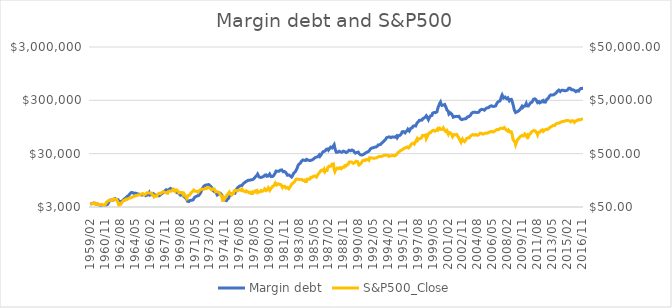
| Category | Margin debt |
|---|---|
| 1959/02 | 3452 |
| 1959/03 | 3410 |
| 1959/04 | 3458 |
| 1959/05 | 3567 |
| 1959/06 | 3549 |
| 1959/07 | 3546 |
| 1959/08 | 3528 |
| 1959/09 | 3424 |
| 1959/10 | 3406 |
| 1959/11 | 3378 |
| 1959/12 | 3438 |
| 1960/01 | 3430 |
| 1960/02 | 3333 |
| 1960/03 | 3267 |
| 1960/04 | 3145 |
| 1960/05 | 3150 |
| 1960/06 | 3151 |
| 1960/07 | 3188 |
| 1960/08 | 3113 |
| 1960/09 | 3220 |
| 1960/10 | 3259 |
| 1960/11 | 3243 |
| 1960/12 | 3240 |
| 1961/01 | 3317 |
| 1961/02 | 3330 |
| 1961/03 | 3426 |
| 1961/04 | 3656 |
| 1961/05 | 3986 |
| 1961/06 | 4100 |
| 1961/07 | 4076 |
| 1961/08 | 4041 |
| 1961/09 | 4021 |
| 1961/10 | 4037 |
| 1961/11 | 4072 |
| 1961/12 | 4180 |
| 1962/01 | 4294 |
| 1962/02 | 4145 |
| 1962/03 | 4100 |
| 1962/04 | 4117 |
| 1962/05 | 4115 |
| 1962/06 | 4034 |
| 1962/07 | 3637 |
| 1962/08 | 3592 |
| 1962/09 | 3796 |
| 1962/10 | 3914 |
| 1962/11 | 3889 |
| 1962/12 | 3975 |
| 1963/01 | 4149 |
| 1963/02 | 4236 |
| 1963/03 | 4355 |
| 1963/04 | 4358 |
| 1963/05 | 4551 |
| 1963/06 | 4760 |
| 1963/07 | 4930 |
| 1963/08 | 4920 |
| 1963/09 | 5057 |
| 1963/10 | 5356 |
| 1963/11 | 5524 |
| 1963/12 | 5621 |
| 1964/01 | 5541 |
| 1964/02 | 5546 |
| 1964/03 | 5405 |
| 1964/04 | 5387 |
| 1964/05 | 5531 |
| 1964/06 | 5458 |
| 1964/07 | 5388 |
| 1964/08 | 5314 |
| 1964/09 | 5207 |
| 1964/10 | 5241 |
| 1964/11 | 5205 |
| 1964/12 | 5181 |
| 1965/01 | 5101 |
| 1965/02 | 5019 |
| 1965/03 | 5038 |
| 1965/04 | 5085 |
| 1965/05 | 5096 |
| 1965/06 | 5154 |
| 1965/07 | 5139 |
| 1965/08 | 4887 |
| 1965/09 | 4908 |
| 1965/10 | 5016 |
| 1965/11 | 5096 |
| 1965/12 | 5232 |
| 1966/01 | 5543 |
| 1966/02 | 5020 |
| 1966/03 | 5110 |
| 1966/04 | 5120 |
| 1966/05 | 5270 |
| 1966/06 | 5070 |
| 1966/07 | 5310 |
| 1966/08 | 5180 |
| 1966/09 | 5060 |
| 1966/10 | 5020 |
| 1966/11 | 4950 |
| 1966/12 | 4950 |
| 1967/01 | 4910 |
| 1967/02 | 4810 |
| 1967/03 | 4870 |
| 1967/04 | 5010 |
| 1967/05 | 5090 |
| 1967/06 | 5160 |
| 1967/07 | 5360 |
| 1967/08 | 5490 |
| 1967/09 | 5620 |
| 1967/10 | 5810 |
| 1967/11 | 6020 |
| 1967/12 | 6090 |
| 1968/01 | 6310 |
| 1968/02 | 6150 |
| 1968/03 | 6150 |
| 1968/04 | 6190 |
| 1968/05 | 6430 |
| 1968/06 | 6640 |
| 1968/07 | 6690 |
| 1968/08 | 6510 |
| 1968/09 | 6430 |
| 1968/10 | 6380 |
| 1968/11 | 6240 |
| 1968/12 | 6200 |
| 1969/01 | 6220 |
| 1969/02 | 5930 |
| 1969/03 | 5750 |
| 1969/04 | 5600 |
| 1969/05 | 5570 |
| 1969/06 | 5670 |
| 1969/07 | 5340 |
| 1969/08 | 5170 |
| 1969/09 | 5000 |
| 1969/10 | 4940 |
| 1969/11 | 5040 |
| 1969/12 | 5070 |
| 1970/01 | 4970 |
| 1970/02 | 4680 |
| 1970/03 | 4570 |
| 1970/04 | 4520 |
| 1970/05 | 4360 |
| 1970/06 | 4160 |
| 1970/07 | 3850 |
| 1970/08 | 3780 |
| 1970/09 | 3800 |
| 1970/10 | 3910 |
| 1970/11 | 3990 |
| 1970/12 | 4000 |
| 1971/01 | 4010 |
| 1971/02 | 3990 |
| 1971/03 | 4090 |
| 1971/04 | 4300 |
| 1971/05 | 4530 |
| 1971/06 | 4620 |
| 1971/07 | 4720 |
| 1971/08 | 4790 |
| 1971/09 | 4850 |
| 1971/10 | 4930 |
| 1971/11 | 4950 |
| 1971/12 | 4910 |
| 1972/01 | 5400 |
| 1972/02 | 5700 |
| 1972/03 | 6180 |
| 1972/04 | 6620 |
| 1972/05 | 7010 |
| 1972/06 | 7200 |
| 1972/07 | 7510 |
| 1972/08 | 7660 |
| 1972/09 | 7780 |
| 1972/10 | 7800 |
| 1972/11 | 7800 |
| 1972/12 | 7890 |
| 1973/01 | 7900 |
| 1973/02 | 7700 |
| 1973/03 | 7500 |
| 1973/04 | 7200 |
| 1973/05 | 7040 |
| 1973/06 | 6540 |
| 1973/07 | 6180 |
| 1973/08 | 6010 |
| 1973/09 | 5830 |
| 1973/10 | 5730 |
| 1973/11 | 5690 |
| 1973/12 | 5460 |
| 1974/01 | 5050 |
| 1974/02 | 5210 |
| 1974/03 | 5310 |
| 1974/04 | 5420 |
| 1974/05 | 5450 |
| 1974/06 | 5260 |
| 1974/07 | 5160 |
| 1974/08 | 4840 |
| 1974/09 | 4590 |
| 1974/10 | 4090 |
| 1974/11 | 4000 |
| 1974/12 | 4040 |
| 1975/01 | 3910 |
| 1975/02 | 3950 |
| 1975/03 | 4130 |
| 1975/04 | 4180 |
| 1975/05 | 4360 |
| 1975/06 | 4700 |
| 1975/07 | 4990 |
| 1975/08 | 5330 |
| 1975/09 | 5220 |
| 1975/10 | 5250 |
| 1975/11 | 5300 |
| 1975/12 | 5370 |
| 1976/01 | 5390 |
| 1976/02 | 5420 |
| 1976/03 | 5950 |
| 1976/04 | 6410 |
| 1976/05 | 6690 |
| 1976/06 | 6940 |
| 1976/07 | 7080 |
| 1976/08 | 7340 |
| 1976/09 | 7450 |
| 1976/10 | 7530 |
| 1976/11 | 7530 |
| 1976/12 | 7610 |
| 1977/01 | 7960 |
| 1977/02 | 8270 |
| 1977/03 | 8480 |
| 1977/04 | 8690 |
| 1977/05 | 8880 |
| 1977/06 | 9070 |
| 1977/07 | 9230 |
| 1977/08 | 9460 |
| 1977/09 | 9560 |
| 1977/10 | 9590 |
| 1977/11 | 9560 |
| 1977/12 | 9610 |
| 1978/01 | 9740 |
| 1978/02 | 9590 |
| 1978/03 | 9780 |
| 1978/04 | 9920 |
| 1978/05 | 10260 |
| 1978/06 | 10660 |
| 1978/07 | 11090 |
| 1978/08 | 11190 |
| 1978/09 | 11740 |
| 1978/10 | 12400 |
| 1978/11 | 12090 |
| 1978/12 | 11000 |
| 1979/01 | 10830 |
| 1979/02 | 10750 |
| 1979/03 | 10790 |
| 1979/04 | 10870 |
| 1979/05 | 11220 |
| 1979/06 | 11130 |
| 1979/07 | 11590 |
| 1979/08 | 11840 |
| 1979/09 | 12060 |
| 1979/10 | 12000 |
| 1979/11 | 11310 |
| 1979/12 | 10920 |
| 1980/01 | 11450 |
| 1980/02 | 11820 |
| 1980/03 | 12460 |
| 1980/04 | 11740 |
| 1980/05 | 11140 |
| 1980/06 | 11270 |
| 1980/07 | 11200 |
| 1980/08 | 11320 |
| 1980/09 | 11800 |
| 1980/10 | 12520 |
| 1980/11 | 13080 |
| 1980/12 | 14140 |
| 1981/01 | 14500 |
| 1981/02 | 14020 |
| 1981/03 | 13950 |
| 1981/04 | 14020 |
| 1981/05 | 14630 |
| 1981/06 | 14700 |
| 1981/07 | 14880 |
| 1981/08 | 14890 |
| 1981/09 | 14310 |
| 1981/10 | 13760 |
| 1981/11 | 13660 |
| 1981/12 | 13860 |
| 1982/01 | 14150 |
| 1982/02 | 13190 |
| 1982/03 | 12770 |
| 1982/04 | 11840 |
| 1982/05 | 11950 |
| 1982/06 | 11990 |
| 1982/07 | 11540 |
| 1982/08 | 11470 |
| 1982/09 | 11150 |
| 1982/10 | 10950 |
| 1982/11 | 11450 |
| 1982/12 | 12170 |
| 1983/01 | 12980 |
| 1983/02 | 13070 |
| 1983/03 | 13680 |
| 1983/04 | 14170 |
| 1983/05 | 15260 |
| 1983/06 | 16370 |
| 1983/07 | 17930 |
| 1983/08 | 18870 |
| 1983/09 | 19090 |
| 1983/10 | 19760 |
| 1983/11 | 20690 |
| 1983/12 | 21790 |
| 1984/01 | 22720 |
| 1984/02 | 22870 |
| 1984/03 | 22330 |
| 1984/04 | 22460 |
| 1984/05 | 22830 |
| 1984/06 | 22360 |
| 1984/07 | 23450 |
| 1984/08 | 22980 |
| 1984/09 | 22810 |
| 1984/10 | 22800 |
| 1984/11 | 22330 |
| 1984/12 | 22350 |
| 1985/01 | 22470 |
| 1985/02 | 22090 |
| 1985/03 | 22970 |
| 1985/04 | 23230 |
| 1985/05 | 23900 |
| 1985/06 | 24300 |
| 1985/07 | 25260 |
| 1985/08 | 25220 |
| 1985/09 | 25780 |
| 1985/10 | 25330 |
| 1985/11 | 26350 |
| 1985/12 | 26640 |
| 1986/01 | 28390 |
| 1986/02 | 26810 |
| 1986/03 | 27450 |
| 1986/04 | 29090 |
| 1986/05 | 30760 |
| 1986/06 | 32370 |
| 1986/07 | 32480 |
| 1986/08 | 33170 |
| 1986/09 | 34550 |
| 1986/10 | 34580 |
| 1986/11 | 36310 |
| 1986/12 | 37090 |
| 1987/01 | 36840 |
| 1987/02 | 34960 |
| 1987/03 | 35740 |
| 1987/04 | 38080 |
| 1987/05 | 39820 |
| 1987/06 | 38890 |
| 1987/07 | 38420 |
| 1987/08 | 40250 |
| 1987/09 | 41640 |
| 1987/10 | 44170 |
| 1987/11 | 38250 |
| 1987/12 | 34180 |
| 1988/01 | 31990 |
| 1988/02 | 31320 |
| 1988/03 | 31990 |
| 1988/04 | 32660 |
| 1988/05 | 33270 |
| 1988/06 | 33070 |
| 1988/07 | 32300 |
| 1988/08 | 31770 |
| 1988/09 | 31930 |
| 1988/10 | 32770 |
| 1988/11 | 33410 |
| 1988/12 | 33640 |
| 1989/01 | 32740 |
| 1989/02 | 32530 |
| 1989/03 | 31480 |
| 1989/04 | 32130 |
| 1989/05 | 32610 |
| 1989/06 | 33140 |
| 1989/07 | 34730 |
| 1989/08 | 34360 |
| 1989/09 | 33940 |
| 1989/10 | 35020 |
| 1989/11 | 35110 |
| 1989/12 | 34630 |
| 1990/01 | 34320 |
| 1990/02 | 32640 |
| 1990/03 | 31480 |
| 1990/04 | 30760 |
| 1990/05 | 31060 |
| 1990/06 | 31600 |
| 1990/07 | 31720 |
| 1990/08 | 32130 |
| 1990/09 | 30350 |
| 1990/10 | 29640 |
| 1990/11 | 28650 |
| 1990/12 | 27820 |
| 1991/01 | 28320 |
| 1991/02 | 27390 |
| 1991/03 | 28860 |
| 1991/04 | 29660 |
| 1991/05 | 30020 |
| 1991/06 | 29980 |
| 1991/07 | 31280 |
| 1991/08 | 30600 |
| 1991/09 | 32240 |
| 1991/10 | 33170 |
| 1991/11 | 33360 |
| 1991/12 | 34840 |
| 1992/01 | 36660 |
| 1992/02 | 36350 |
| 1992/03 | 38200 |
| 1992/04 | 39090 |
| 1992/05 | 38750 |
| 1992/06 | 39890 |
| 1992/07 | 39690 |
| 1992/08 | 39640 |
| 1992/09 | 39940 |
| 1992/10 | 41250 |
| 1992/11 | 41590 |
| 1992/12 | 43630 |
| 1993/01 | 43990 |
| 1993/02 | 44020 |
| 1993/03 | 44290 |
| 1993/04 | 45160 |
| 1993/05 | 47420 |
| 1993/06 | 48630 |
| 1993/07 | 49550 |
| 1993/08 | 49080 |
| 1993/09 | 52760 |
| 1993/10 | 53700 |
| 1993/11 | 56690 |
| 1993/12 | 59760 |
| 1994/01 | 60310 |
| 1994/02 | 61250 |
| 1994/03 | 62020 |
| 1994/04 | 61960 |
| 1994/05 | 60700 |
| 1994/06 | 59870 |
| 1994/07 | 59550 |
| 1994/08 | 61930 |
| 1994/09 | 63070 |
| 1994/10 | 61630 |
| 1994/11 | 62150 |
| 1994/12 | 61000 |
| 1995/01 | 61160 |
| 1995/02 | 64380 |
| 1995/03 | 59800 |
| 1995/04 | 60270 |
| 1995/05 | 65520 |
| 1995/06 | 64070 |
| 1995/07 | 66340 |
| 1995/08 | 67600 |
| 1995/09 | 71440 |
| 1995/10 | 77076 |
| 1995/11 | 75005 |
| 1995/12 | 77875 |
| 1996/01 | 76680 |
| 1996/02 | 73530 |
| 1996/03 | 77090 |
| 1996/04 | 78308 |
| 1996/05 | 81170 |
| 1996/06 | 86100 |
| 1996/07 | 87160 |
| 1996/08 | 79860 |
| 1996/09 | 82980 |
| 1996/10 | 89300 |
| 1996/11 | 88740 |
| 1996/12 | 91680 |
| 1997/01 | 97400 |
| 1997/02 | 99460 |
| 1997/03 | 100000 |
| 1997/04 | 100160 |
| 1997/05 | 98870 |
| 1997/06 | 106010 |
| 1997/07 | 113440 |
| 1997/08 | 116190 |
| 1997/09 | 119810 |
| 1997/10 | 126050 |
| 1997/11 | 128190 |
| 1997/12 | 127330 |
| 1998/01 | 126090 |
| 1998/02 | 127790 |
| 1998/03 | 135590 |
| 1998/04 | 140340 |
| 1998/05 | 140240 |
| 1998/06 | 143600 |
| 1998/07 | 147700 |
| 1998/08 | 154370 |
| 1998/09 | 147800 |
| 1998/10 | 137540 |
| 1998/11 | 130160 |
| 1998/12 | 139710 |
| 1999/01 | 140980 |
| 1999/02 | 153240 |
| 1999/03 | 151530 |
| 1999/04 | 156440 |
| 1999/05 | 172880 |
| 1999/06 | 177984 |
| 1999/07 | 176930 |
| 1999/08 | 178360 |
| 1999/09 | 176390 |
| 1999/10 | 179316 |
| 1999/11 | 182272 |
| 1999/12 | 206280 |
| 2000/01 | 228530 |
| 2000/02 | 243490 |
| 2000/03 | 265210 |
| 2000/04 | 278530 |
| 2000/05 | 251700 |
| 2000/06 | 240660 |
| 2000/07 | 247200 |
| 2000/08 | 244970 |
| 2000/09 | 247560 |
| 2000/10 | 250780 |
| 2000/11 | 233380 |
| 2000/12 | 219110 |
| 2001/01 | 198790 |
| 2001/02 | 197110 |
| 2001/03 | 186870 |
| 2001/04 | 165350 |
| 2001/05 | 166940 |
| 2001/06 | 174180 |
| 2001/07 | 170000 |
| 2001/08 | 165250 |
| 2001/09 | 161130 |
| 2001/10 | 144670 |
| 2001/11 | 144010 |
| 2001/12 | 148650 |
| 2002/01 | 150450 |
| 2002/02 | 150390 |
| 2002/03 | 147030 |
| 2002/04 | 149370 |
| 2002/05 | 150940 |
| 2002/06 | 150860 |
| 2002/07 | 146270 |
| 2002/08 | 136160 |
| 2002/09 | 132800 |
| 2002/10 | 130210 |
| 2002/11 | 130570 |
| 2002/12 | 133060 |
| 2003/01 | 134380 |
| 2003/02 | 134910 |
| 2003/03 | 134030 |
| 2003/04 | 135910 |
| 2003/05 | 140450 |
| 2003/06 | 146380 |
| 2003/07 | 148550 |
| 2003/08 | 148450 |
| 2003/09 | 149660 |
| 2003/10 | 155870 |
| 2003/11 | 162720 |
| 2003/12 | 172140 |
| 2004/01 | 173220 |
| 2004/02 | 178820 |
| 2004/03 | 180360 |
| 2004/04 | 179710 |
| 2004/05 | 181280 |
| 2004/06 | 178470 |
| 2004/07 | 180090 |
| 2004/08 | 177030 |
| 2004/09 | 177100 |
| 2004/10 | 180100 |
| 2004/11 | 185700 |
| 2004/12 | 196990 |
| 2005/01 | 203790 |
| 2005/02 | 203320 |
| 2005/03 | 199480 |
| 2005/04 | 201690 |
| 2005/05 | 194160 |
| 2005/06 | 196270 |
| 2005/07 | 200500 |
| 2005/08 | 210940 |
| 2005/09 | 208660 |
| 2005/10 | 217760 |
| 2005/11 | 212540 |
| 2005/12 | 219020 |
| 2006/01 | 221660 |
| 2006/02 | 232190 |
| 2006/03 | 222780 |
| 2006/04 | 236670 |
| 2006/05 | 241540 |
| 2006/06 | 230540 |
| 2006/07 | 225780 |
| 2006/08 | 231490 |
| 2006/09 | 226480 |
| 2006/10 | 237120 |
| 2006/11 | 244370 |
| 2006/12 | 270520 |
| 2007/01 | 275380 |
| 2007/02 | 285610 |
| 2007/03 | 295870 |
| 2007/04 | 293160 |
| 2007/05 | 317990 |
| 2007/06 | 353030 |
| 2007/07 | 378240 |
| 2007/08 | 381370 |
| 2007/09 | 331370 |
| 2007/10 | 329510 |
| 2007/11 | 345420 |
| 2007/12 | 344300 |
| 2008/01 | 322780 |
| 2008/02 | 328330 |
| 2008/03 | 334900 |
| 2008/04 | 311660 |
| 2008/05 | 295550 |
| 2008/06 | 310310 |
| 2008/07 | 314360 |
| 2008/08 | 313290 |
| 2008/09 | 292110 |
| 2008/10 | 299960 |
| 2008/11 | 233350 |
| 2008/12 | 201480 |
| 2009/01 | 186710 |
| 2009/02 | 177170 |
| 2009/03 | 173300 |
| 2009/04 | 182160 |
| 2009/05 | 184120 |
| 2009/06 | 189250 |
| 2009/07 | 188140 |
| 2009/08 | 199460 |
| 2009/09 | 206720 |
| 2009/10 | 220790 |
| 2009/11 | 231820 |
| 2009/12 | 220958 |
| 2010/01 | 230879 |
| 2010/02 | 233683 |
| 2010/03 | 233736 |
| 2010/04 | 246407 |
| 2010/05 | 261859 |
| 2010/06 | 236149 |
| 2010/07 | 231057 |
| 2010/08 | 235848 |
| 2010/09 | 235748 |
| 2010/10 | 256375 |
| 2010/11 | 269591 |
| 2010/12 | 274008 |
| 2011/01 | 276558 |
| 2011/02 | 289553 |
| 2011/03 | 310271 |
| 2011/04 | 315695 |
| 2011/05 | 320706 |
| 2011/06 | 315378 |
| 2011/07 | 305888 |
| 2011/08 | 305874 |
| 2011/09 | 271952 |
| 2011/10 | 262076 |
| 2011/11 | 283243 |
| 2011/12 | 269123 |
| 2012/01 | 267015 |
| 2012/02 | 276450 |
| 2012/03 | 289429 |
| 2012/04 | 295927 |
| 2012/05 | 298503 |
| 2012/06 | 279170 |
| 2012/07 | 284626 |
| 2012/08 | 277698 |
| 2012/09 | 286615 |
| 2012/10 | 315112 |
| 2012/11 | 317510 |
| 2012/12 | 326990 |
| 2013/01 | 330356 |
| 2013/02 | 364107 |
| 2013/03 | 366139 |
| 2013/04 | 379522 |
| 2013/05 | 384370 |
| 2013/06 | 377002 |
| 2013/07 | 376632 |
| 2013/08 | 382102 |
| 2013/09 | 382926 |
| 2013/10 | 401239 |
| 2013/11 | 412459 |
| 2013/12 | 423703 |
| 2014/01 | 444931 |
| 2014/02 | 451298 |
| 2014/03 | 465720 |
| 2014/04 | 450283 |
| 2014/05 | 437155 |
| 2014/06 | 438547 |
| 2014/07 | 464311 |
| 2014/08 | 460231 |
| 2014/09 | 463018 |
| 2014/10 | 463878 |
| 2014/11 | 453841 |
| 2014/12 | 457106 |
| 2015/01 | 456283 |
| 2015/02 | 444836 |
| 2015/03 | 464933 |
| 2015/04 | 476381 |
| 2015/05 | 507153 |
| 2015/06 | 499143 |
| 2015/07 | 504975 |
| 2015/08 | 487354 |
| 2015/09 | 473412 |
| 2015/10 | 453896 |
| 2015/11 | 471922 |
| 2015/12 | 472772 |
| 2016/01 | 461200 |
| 2016/02 | 447681 |
| 2016/03 | 435814 |
| 2016/04 | 445846 |
| 2016/05 | 455646 |
| 2016/06 | 451094 |
| 2016/07 | 447337 |
| 2016/08 | 474575 |
| 2016/09 | 471231 |
| 2016/10 | 501125 |
| 2016/11 | 483978 |
| 2016/12 | 500442 |
| 2017/01 | 489523 |
| 2017/02 | 513278 |